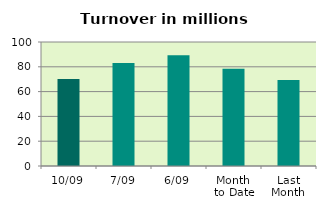
| Category | Series 0 |
|---|---|
| 10/09 | 70.194 |
| 7/09 | 83.02 |
| 6/09 | 89.32 |
| Month 
to Date | 78.488 |
| Last
Month | 69.378 |